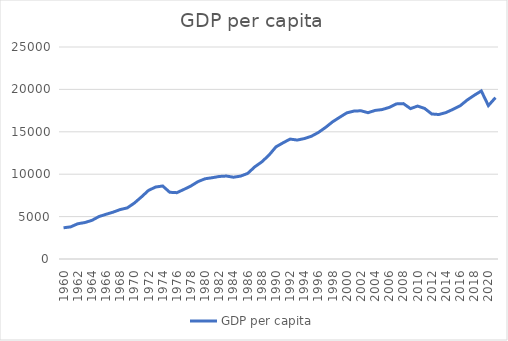
| Category | GDP per capita |
|---|---|
| 1960.0 | 3682 |
| 1961.0 | 3786.5 |
| 1962.0 | 4154.9 |
| 1963.0 | 4297 |
| 1964.0 | 4554.6 |
| 1965.0 | 5003.7 |
| 1966.0 | 5271.1 |
| 1967.0 | 5524.6 |
| 1968.0 | 5829.9 |
| 1969.0 | 6025.7 |
| 1970.0 | 6594.6 |
| 1971.0 | 7317.4 |
| 1972.0 | 8089.3 |
| 1973.0 | 8484.7 |
| 1974.0 | 8611.1 |
| 1975.0 | 7867.6 |
| 1976.0 | 7822.1 |
| 1977.0 | 8205.1 |
| 1978.0 | 8617.5 |
| 1979.0 | 9131 |
| 1980.0 | 9463.2 |
| 1981.0 | 9585.5 |
| 1982.0 | 9733.2 |
| 1983.0 | 9782.3 |
| 1984.0 | 9643.2 |
| 1985.0 | 9774.2 |
| 1986.0 | 10089.5 |
| 1987.0 | 10862.5 |
| 1988.0 | 11454.5 |
| 1989.0 | 12233.9 |
| 1990.0 | 13224.2 |
| 1991.0 | 13701.3 |
| 1992.0 | 14141.2 |
| 1993.0 | 14026.8 |
| 1994.0 | 14197.5 |
| 1995.0 | 14474.8 |
| 1996.0 | 14925.9 |
| 1997.0 | 15513.3 |
| 1998.0 | 16177.2 |
| 1999.0 | 16714.4 |
| 2000.0 | 17230.7 |
| 2001.0 | 17442.2 |
| 2002.0 | 17480.6 |
| 2003.0 | 17253.1 |
| 2004.0 | 17519.7 |
| 2005.0 | 17624 |
| 2006.0 | 17878.1 |
| 2007.0 | 18290.3 |
| 2008.0 | 18322.3 |
| 2009.0 | 17733.3 |
| 2010.0 | 18033.2 |
| 2011.0 | 17753.4 |
| 2012.0 | 17102.3 |
| 2013.0 | 17037.7 |
| 2014.0 | 17265.6 |
| 2015.0 | 17647.9 |
| 2016.0 | 18061.2 |
| 2017.0 | 18740.1 |
| 2018.0 | 19305 |
| 2019.0 | 19818.2 |
| 2020.0 | 18089.6 |
| 2021.0 | 19029.7 |